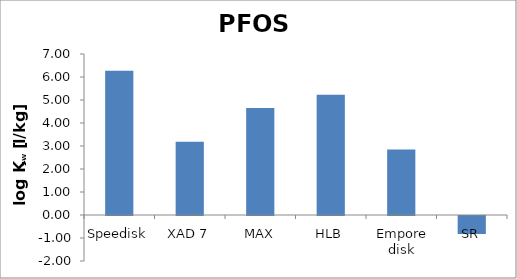
| Category | PFOS  |
|---|---|
| Speedisk | 6.268 |
| XAD 7 | 3.182 |
| MAX | 4.657 |
| HLB | 5.23 |
| Empore disk | 2.845 |
| SR | -0.784 |